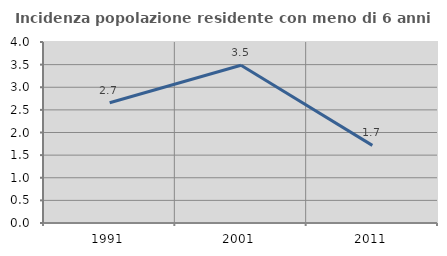
| Category | Incidenza popolazione residente con meno di 6 anni |
|---|---|
| 1991.0 | 2.658 |
| 2001.0 | 3.486 |
| 2011.0 | 1.716 |